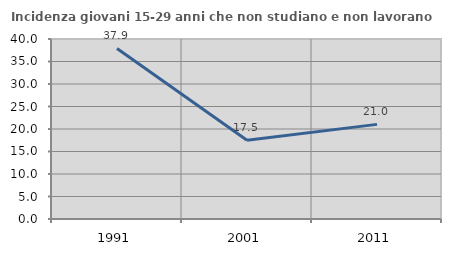
| Category | Incidenza giovani 15-29 anni che non studiano e non lavorano  |
|---|---|
| 1991.0 | 37.9 |
| 2001.0 | 17.513 |
| 2011.0 | 21.027 |